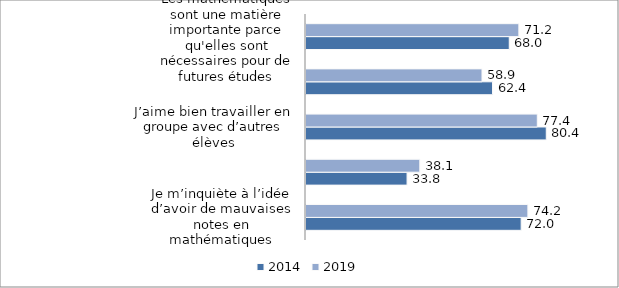
| Category | 2014 | 2019 |
|---|---|---|
| Je m’inquiète à l’idée d’avoir de mauvaises notes en mathématiques | 71.96 | 74.21 |
| Je deviens très nerveux (nerveuse) quand je travaille à des problèmes de mathématiques | 33.8 | 38.06 |
| J’aime bien travailler en groupe avec d’autres élèves | 80.36 | 77.36 |
| J’apprends mieux en mathématiques quand je travaille avec d’autres élèves de ma classe  | 62.38 | 58.86 |
| Les mathématiques sont une matière importante parce qu'elles sont nécessaires pour de futures études | 67.98 | 71.19 |